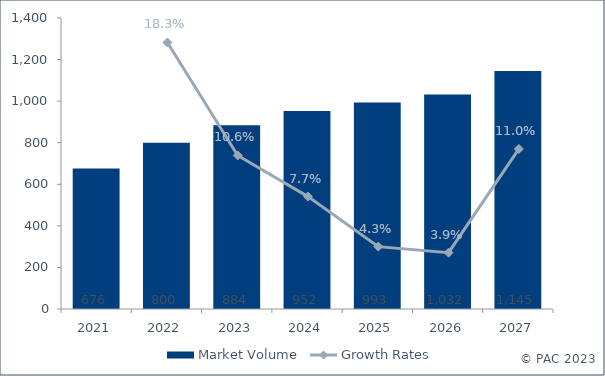
| Category | Market Volume |
|---|---|
| 2021.0 | 675.893 |
| 2022.0 | 799.705 |
| 2023.0 | 884.105 |
| 2024.0 | 952.415 |
| 2025.0 | 993.247 |
| 2026.0 | 1031.707 |
| 2027.0 | 1145.191 |